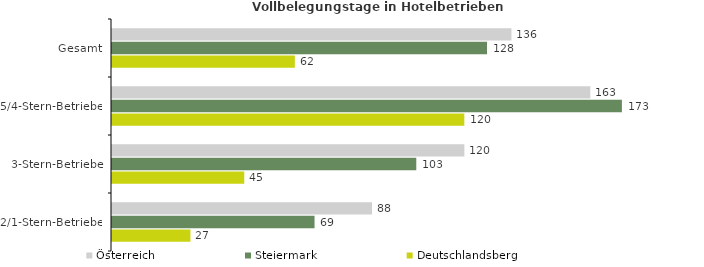
| Category | Österreich | Steiermark | Deutschlandsberg |
|---|---|---|---|
| Gesamt | 135.866 | 127.561 | 62.19 |
| 5/4-Stern-Betriebe | 162.683 | 173.435 | 119.832 |
| 3-Stern-Betriebe | 119.851 | 103.499 | 44.988 |
| 2/1-Stern-Betriebe | 88.435 | 68.894 | 26.681 |